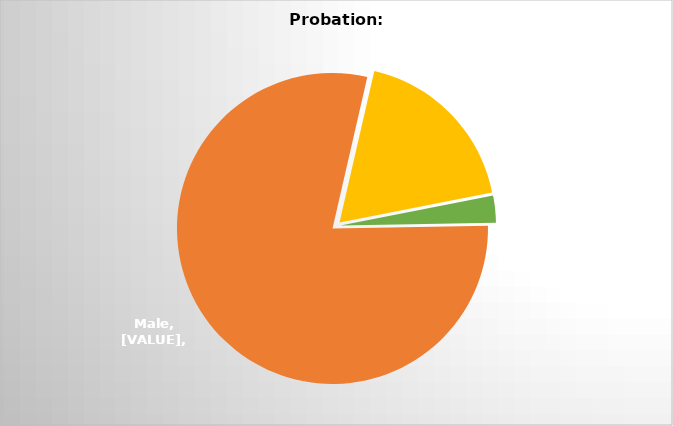
| Category | Series 1 | Series 0 |
|---|---|---|
| 0 | 56 | 48 |
| 1 | 13 | 183 |
| 2 | 2 | 6 |